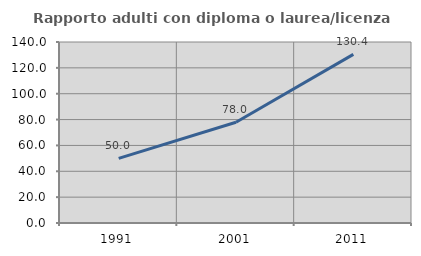
| Category | Rapporto adulti con diploma o laurea/licenza media  |
|---|---|
| 1991.0 | 50 |
| 2001.0 | 77.957 |
| 2011.0 | 130.405 |